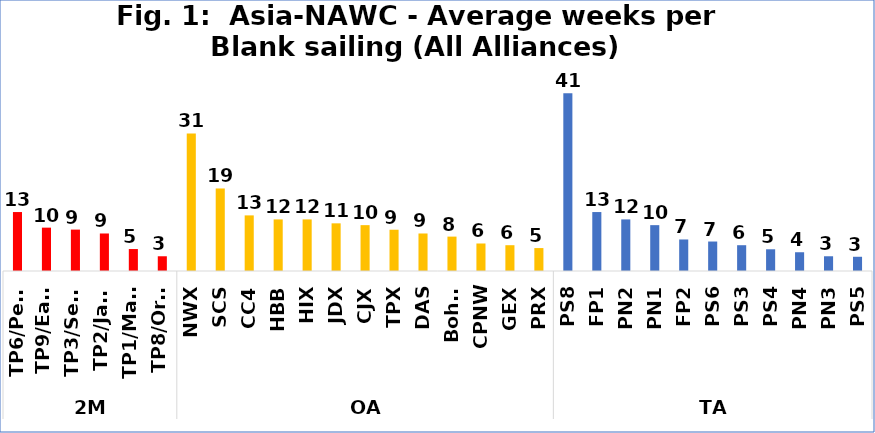
| Category | Series 0 |
|---|---|
| 0 | 13.429 |
| 1 | 9.875 |
| 2 | 9.429 |
| 3 | 8.545 |
| 4 | 5 |
| 5 | 3.357 |
| 6 | 31.333 |
| 7 | 18.8 |
| 8 | 12.667 |
| 9 | 11.75 |
| 10 | 11.75 |
| 11 | 10.857 |
| 12 | 10.444 |
| 13 | 9.4 |
| 14 | 8.545 |
| 15 | 7.833 |
| 16 | 6.267 |
| 17 | 5.875 |
| 18 | 5.222 |
| 19 | 40.5 |
| 20 | 13.429 |
| 21 | 11.75 |
| 22 | 10.444 |
| 23 | 7.182 |
| 24 | 6.714 |
| 25 | 5.875 |
| 26 | 4.947 |
| 27 | 4.273 |
| 28 | 3.357 |
| 29 | 3.241 |